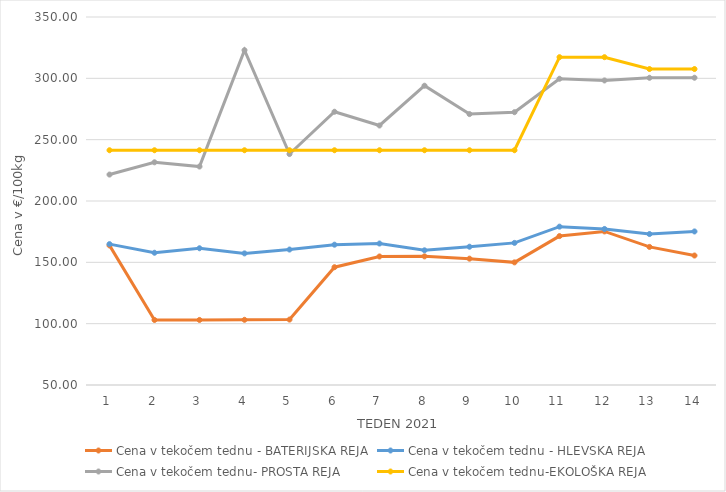
| Category | Cena v tekočem tednu - BATERIJSKA REJA | Cena v tekočem tednu - HLEVSKA REJA | Cena v tekočem tednu- PROSTA REJA | Cena v tekočem tednu-EKOLOŠKA REJA |
|---|---|---|---|---|
| 1.0 | 163.81 | 164.86 | 221.55 | 241.38 |
| 2.0 | 103.02 | 157.81 | 231.55 | 241.38 |
| 3.0 | 103.03 | 161.48 | 228.1 | 241.38 |
| 4.0 | 103.15 | 157.29 | 322.93 | 241.38 |
| 5.0 | 103.34 | 160.43 | 238.28 | 241.38 |
| 6.0 | 146.03 | 164.39 | 272.76 | 241.38 |
| 7.0 | 154.77 | 165.34 | 261.55 | 241.38 |
| 8.0 | 154.86 | 159.79 | 293.97 | 241.38 |
| 9.0 | 153 | 162.73 | 270.86 | 241.38 |
| 10.0 | 149.98 | 165.85 | 272.41 | 241.38 |
| 11.0 | 171.4 | 179.09 | 299.66 | 317.24 |
| 12.0 | 175.2 | 177.21 | 298.27 | 317.24 |
| 13.0 | 162.57 | 173.07 | 300.45 | 307.59 |
| 14.0 | 155.55 | 175.17 | 300.49 | 307.59 |